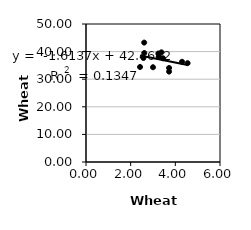
| Category | Series 0 |
|---|---|
| 2.42 | 34.428 |
| 2.57 | 37.674 |
| 3.72 | 34.07 |
| 3.72 | 32.748 |
| 2.61 | 39.498 |
| 3.0 | 34.333 |
| 3.24 | 39.305 |
| 3.26 | 38.213 |
| 3.45 | 37.575 |
| 4.55 | 35.812 |
| 4.3 | 36.314 |
| 3.38 | 39.74 |
| 2.6054916274 | 43.265 |